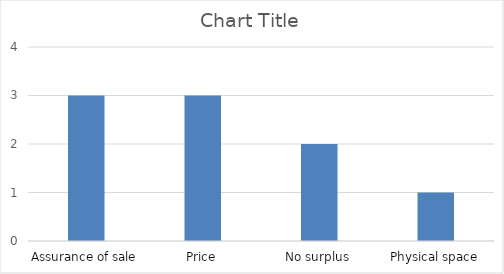
| Category | Series 0 |
|---|---|
| Assurance of sale | 3 |
| Price | 3 |
| No surplus | 2 |
| Physical space | 1 |